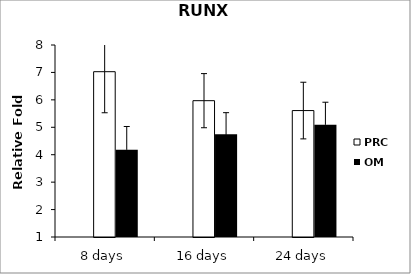
| Category | FBS | PRC | OM |
|---|---|---|---|
| 8 days |  | 7.027 | 4.182 |
| 16 days |  | 5.97 | 4.745 |
| 24 days |  | 5.61 | 5.092 |